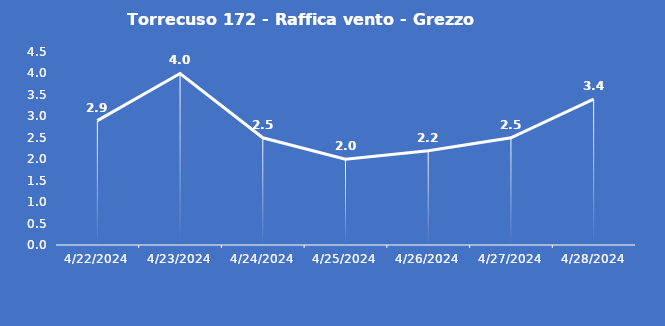
| Category | Torrecuso 172 - Raffica vento - Grezzo (m/s) |
|---|---|
| 4/22/24 | 2.9 |
| 4/23/24 | 4 |
| 4/24/24 | 2.5 |
| 4/25/24 | 2 |
| 4/26/24 | 2.2 |
| 4/27/24 | 2.5 |
| 4/28/24 | 3.4 |